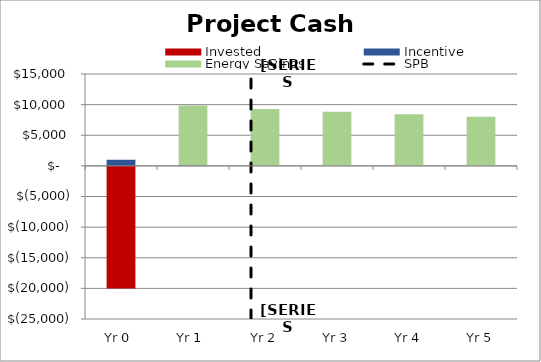
| Category | Invested | Incentive | Energy Savings |
|---|---|---|---|
| Yr 0  | -20000 | 1000 | 5.034 |
| Yr 1  | 0 | 97.6 | 9755.812 |
| Yr 2 | 0 | 0 | 9287.533 |
| Yr 3 | 0 | 0 | 8841.731 |
| Yr 4 | 0 | 0 | 8417.328 |
| Yr 5 | 0 | 0 | 8013.296 |